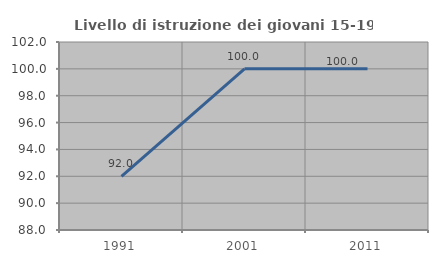
| Category | Livello di istruzione dei giovani 15-19 anni |
|---|---|
| 1991.0 | 92 |
| 2001.0 | 100 |
| 2011.0 | 100 |